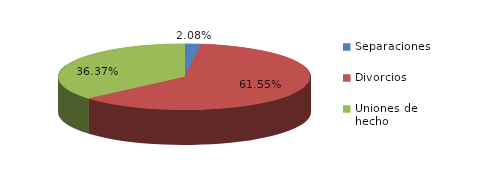
| Category | Series 0 |
|---|---|
| Separaciones | 78 |
| Divorcios | 2308 |
| Uniones de hecho | 1364 |